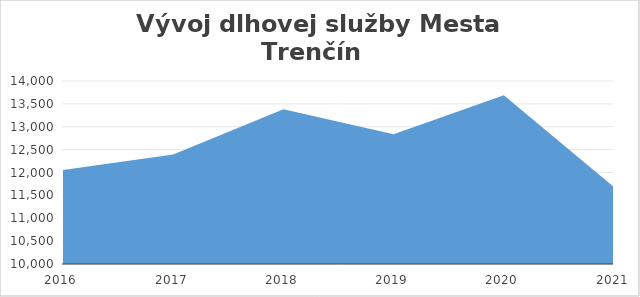
| Category | Series 0 |
|---|---|
| 2016.0 | 12053 |
| 2017.0 | 12394 |
| 2018.0 | 13381 |
| 2019.0 | 12837 |
| 2020.0 | 13686 |
| 2021.0 | 11680 |